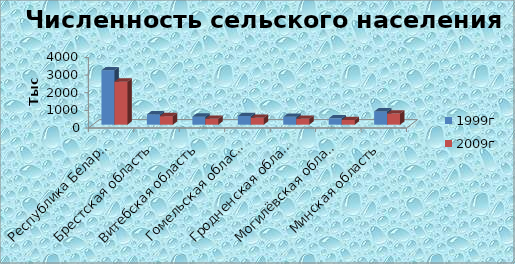
| Category | 1999г | 2009г |
|---|---|---|
| Республика Беларусь | 3084 | 2437 |
| Брестская область | 583 | 482 |
| Витебская область | 454 | 334 |
| Гомельская область | 491 | 390 |
| Гродненская область | 444 | 332 |
| Могилёвская область | 361 | 265 |
| Минская область | 751 | 634 |